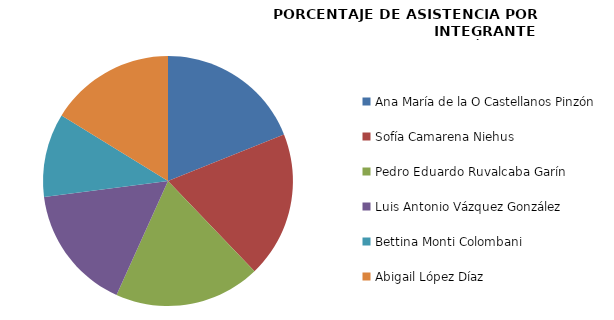
| Category | Series 0 |
|---|---|
| Ana María de la O Castellanos Pinzón | 100 |
| Sofía Camarena Niehus | 100 |
| Pedro Eduardo Ruvalcaba Garín | 100 |
| Luis Antonio Vázquez González | 85.714 |
| Bettina Monti Colombani | 57.143 |
| Abigail López Díaz | 85.714 |